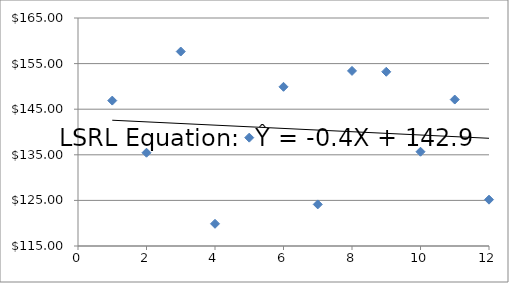
| Category | Series 0 |
|---|---|
| 1.0 | 146.89 |
| 2.0 | 135.45 |
| 3.0 | 157.65 |
| 4.0 | 119.87 |
| 5.0 | 138.76 |
| 6.0 | 149.91 |
| 7.0 | 124.12 |
| 8.0 | 153.4 |
| 9.0 | 153.21 |
| 10.0 | 135.67 |
| 11.0 | 147.12 |
| 12.0 | 125.16 |